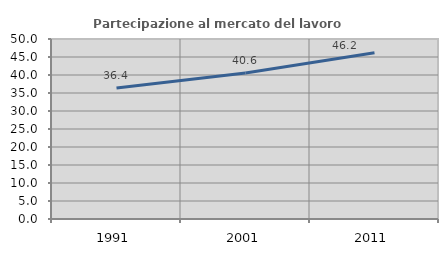
| Category | Partecipazione al mercato del lavoro  femminile |
|---|---|
| 1991.0 | 36.389 |
| 2001.0 | 40.555 |
| 2011.0 | 46.198 |